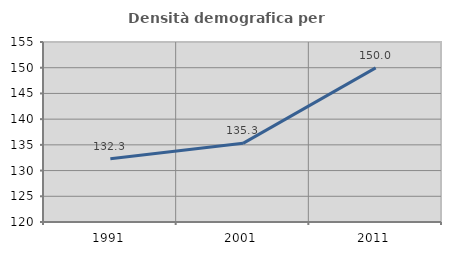
| Category | Densità demografica |
|---|---|
| 1991.0 | 132.287 |
| 2001.0 | 135.292 |
| 2011.0 | 149.959 |